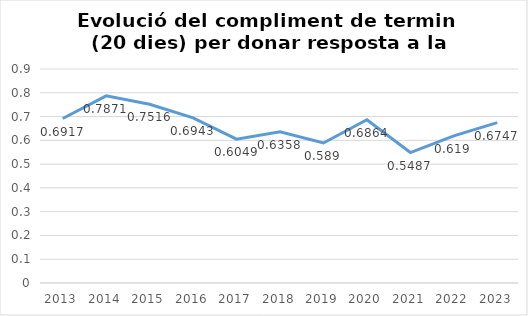
| Category | Series 0 |
|---|---|
| 2013.0 | 0.692 |
| 2014.0 | 0.787 |
| 2015.0 | 0.752 |
| 2016.0 | 0.694 |
| 2017.0 | 0.605 |
| 2018.0 | 0.636 |
| 2019.0 | 0.589 |
| 2020.0 | 0.686 |
| 2021.0 | 0.549 |
| 2022.0 | 0.619 |
| 2023.0 | 0.675 |